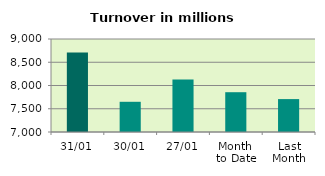
| Category | Series 0 |
|---|---|
| 31/01 | 8707.941 |
| 30/01 | 7649.594 |
| 27/01 | 8130.806 |
| Month 
to Date | 7855.802 |
| Last
Month | 7707.734 |